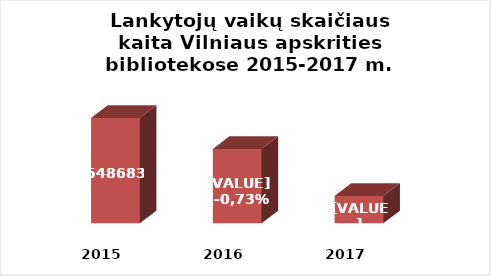
| Category | Series 0 |
|---|---|
| 2015.0 | 548683 |
| 2016.0 | 544662 |
| 2017.0 | 538561 |